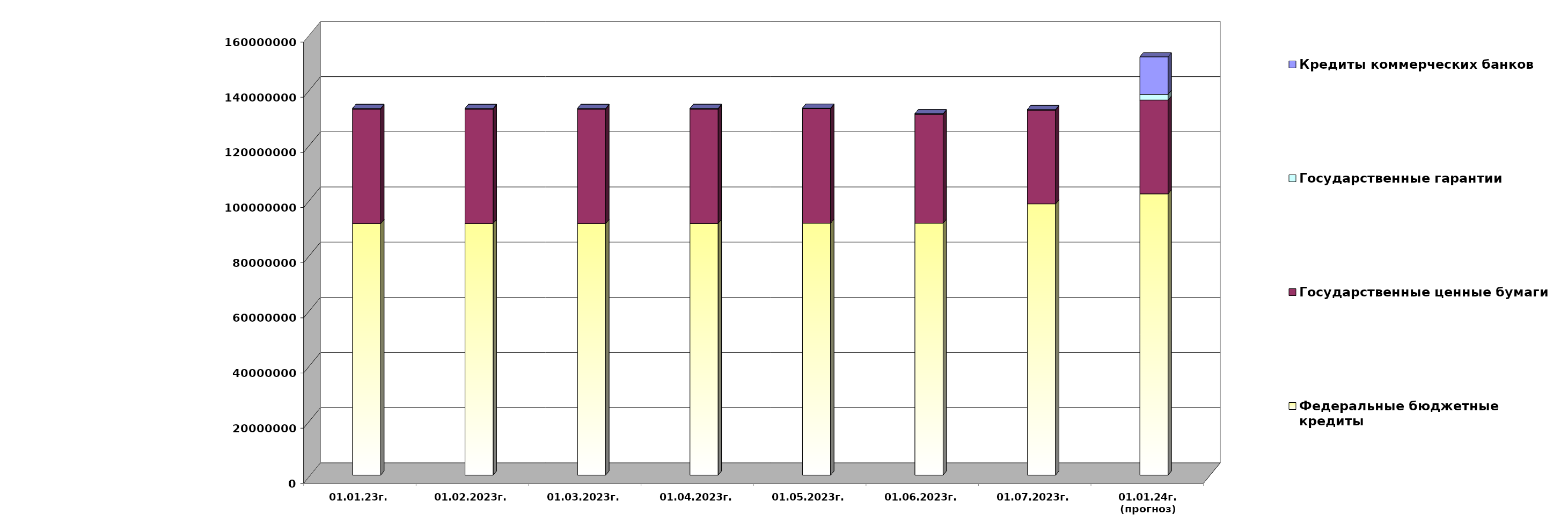
| Category | Федеральные бюджетные кредиты | Государственные ценные бумаги  | Государственные гарантии | Кредиты коммерческих банков |
|---|---|---|---|---|
| 01.01.23г. | 91228290.06 | 41500000 | 219957.743 | 0 |
| 01.02.2023г. | 91228290.06 | 41500000 | 217186.67 | 0 |
| 01.03.2023г. | 91228290.06 | 41500000 | 217186.67 | 0 |
| 01.04.2023г. | 91246617.843 | 41500000 | 218702.544 | 0 |
| 01.05.2023г. | 91334953.062 | 41500000 | 216632.858 | 0 |
| 01.06.2023г. | 91334953.062 | 39500000 | 201889.62 | 0 |
| 01.07.2023г. | 98352839.325 | 34000000 | 202402.323 | 0 |
| 01.01.24г.
(прогноз) | 101994267.9 | 34000000 | 2061427.8 | 13606594.9 |